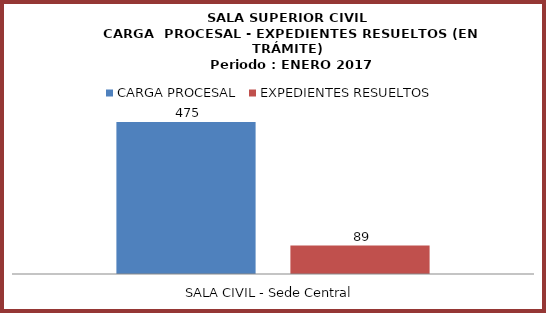
| Category | CARGA PROCESAL | EXPEDIENTES RESUELTOS |
|---|---|---|
| SALA CIVIL - Sede Central | 475 | 89 |